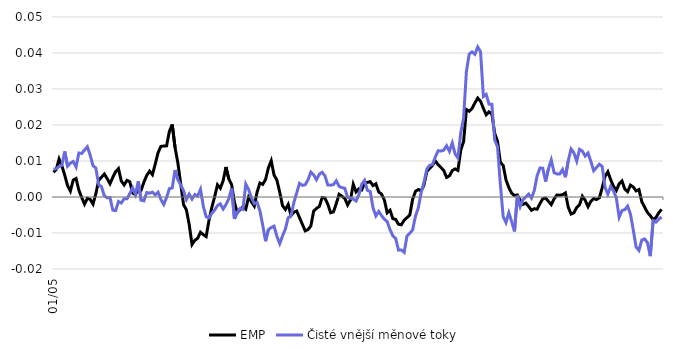
| Category | EMP | Čisté vnější měnové toky |
|---|---|---|
| 2005-01-01 | 0.007 | 0.008 |
| 2005-02-01 | 0.008 | 0.008 |
| 2005-03-01 | 0.011 | 0.008 |
| 2005-04-01 | 0.009 | 0.009 |
| 2005-05-01 | 0.006 | 0.013 |
| 2005-06-01 | 0.003 | 0.009 |
| 2005-07-01 | 0.002 | 0.009 |
| 2005-08-01 | 0.005 | 0.01 |
| 2005-09-01 | 0.005 | 0.008 |
| 2005-10-01 | 0.002 | 0.012 |
| 2005-11-01 | 0 | 0.012 |
| 2005-12-01 | -0.002 | 0.013 |
| 2006-01-01 | 0 | 0.014 |
| 2006-02-01 | -0.001 | 0.012 |
| 2006-03-01 | -0.002 | 0.009 |
| 2006-04-01 | 0.001 | 0.008 |
| 2006-05-01 | 0.005 | 0.003 |
| 2006-06-01 | 0.006 | 0.003 |
| 2006-07-01 | 0.006 | 0 |
| 2006-08-01 | 0.005 | 0 |
| 2006-09-01 | 0.004 | 0 |
| 2006-10-01 | 0.005 | -0.004 |
| 2006-11-01 | 0.007 | -0.004 |
| 2006-12-01 | 0.008 | -0.001 |
| 2007-01-01 | 0.004 | -0.002 |
| 2007-02-01 | 0.003 | 0 |
| 2007-03-01 | 0.005 | -0.001 |
| 2007-04-01 | 0.004 | 0.001 |
| 2007-05-01 | 0.001 | 0.003 |
| 2007-06-01 | 0.001 | 0.001 |
| 2007-07-01 | 0.002 | 0.004 |
| 2007-08-01 | 0.002 | -0.001 |
| 2007-09-01 | 0.004 | -0.001 |
| 2007-10-01 | 0.006 | 0.001 |
| 2007-11-01 | 0.007 | 0.001 |
| 2007-12-01 | 0.006 | 0.001 |
| 2008-01-01 | 0.009 | 0.001 |
| 2008-02-01 | 0.012 | 0.001 |
| 2008-03-01 | 0.014 | -0.001 |
| 2008-04-01 | 0.014 | -0.002 |
| 2008-05-01 | 0.014 | 0 |
| 2008-06-01 | 0.018 | 0.002 |
| 2008-07-01 | 0.02 | 0.003 |
| 2008-08-01 | 0.014 | 0.008 |
| 2008-09-01 | 0.009 | 0.005 |
| 2008-10-01 | 0.004 | 0.003 |
| 2008-11-01 | -0.002 | 0.002 |
| 2008-12-01 | -0.004 | -0.001 |
| 2009-01-01 | -0.008 | 0.001 |
| 2009-02-01 | -0.013 | -0.001 |
| 2009-03-01 | -0.012 | 0.001 |
| 2009-04-01 | -0.011 | 0 |
| 2009-05-01 | -0.01 | 0.002 |
| 2009-06-01 | -0.01 | -0.003 |
| 2009-07-01 | -0.011 | -0.005 |
| 2009-08-01 | -0.006 | -0.006 |
| 2009-09-01 | -0.003 | -0.005 |
| 2009-10-01 | 0 | -0.004 |
| 2009-11-01 | 0.003 | -0.002 |
| 2009-12-01 | 0.002 | -0.002 |
| 2010-01-01 | 0.004 | -0.003 |
| 2010-02-01 | 0.008 | -0.002 |
| 2010-03-01 | 0.005 | 0 |
| 2010-04-01 | 0.003 | 0.002 |
| 2010-05-01 | -0.002 | -0.006 |
| 2010-06-01 | -0.004 | -0.004 |
| 2010-07-01 | -0.004 | -0.003 |
| 2010-08-01 | -0.003 | -0.003 |
| 2010-09-01 | -0.003 | 0.004 |
| 2010-10-01 | 0 | 0.002 |
| 2010-11-01 | -0.001 | 0 |
| 2010-12-01 | -0.003 | -0.002 |
| 2011-01-01 | 0.001 | -0.001 |
| 2011-02-01 | 0.004 | -0.004 |
| 2011-03-01 | 0.004 | -0.008 |
| 2011-04-01 | 0.005 | -0.012 |
| 2011-05-01 | 0.008 | -0.009 |
| 2011-06-01 | 0.01 | -0.008 |
| 2011-07-01 | 0.006 | -0.008 |
| 2011-08-01 | 0.005 | -0.011 |
| 2011-09-01 | 0.001 | -0.013 |
| 2011-10-01 | -0.002 | -0.011 |
| 2011-11-01 | -0.003 | -0.009 |
| 2011-12-01 | -0.002 | -0.006 |
| 2012-01-01 | -0.005 | -0.005 |
| 2012-02-01 | -0.004 | -0.002 |
| 2012-03-01 | -0.004 | 0.001 |
| 2012-04-01 | -0.006 | 0.004 |
| 2012-05-01 | -0.008 | 0.003 |
| 2012-06-01 | -0.009 | 0.003 |
| 2012-07-01 | -0.009 | 0.005 |
| 2012-08-01 | -0.008 | 0.007 |
| 2012-09-01 | -0.004 | 0.006 |
| 2012-10-01 | -0.003 | 0.005 |
| 2012-11-01 | -0.003 | 0.006 |
| 2012-12-01 | 0 | 0.007 |
| 2013-01-01 | 0 | 0.006 |
| 2013-02-01 | -0.002 | 0.003 |
| 2013-03-01 | -0.004 | 0.003 |
| 2013-04-01 | -0.004 | 0.003 |
| 2013-05-01 | -0.002 | 0.004 |
| 2013-06-01 | 0.001 | 0.003 |
| 2013-07-01 | 0 | 0.003 |
| 2013-08-01 | 0 | 0.002 |
| 2013-09-01 | -0.002 | 0 |
| 2013-10-01 | -0.001 | 0 |
| 2013-11-01 | 0.004 | -0.001 |
| 2013-12-01 | 0.001 | -0.001 |
| 2014-01-01 | 0.002 | 0.001 |
| 2014-02-01 | 0.002 | 0.004 |
| 2014-03-01 | 0.004 | 0.005 |
| 2014-04-01 | 0.004 | 0.002 |
| 2014-05-01 | 0.004 | 0.002 |
| 2014-06-01 | 0.003 | -0.003 |
| 2014-07-01 | 0.004 | -0.005 |
| 2014-08-01 | 0.001 | -0.004 |
| 2014-09-01 | 0.001 | -0.005 |
| 2014-10-01 | -0.001 | -0.006 |
| 2014-11-01 | -0.004 | -0.007 |
| 2014-12-01 | -0.004 | -0.009 |
| 2015-01-01 | -0.006 | -0.011 |
| 2015-02-01 | -0.006 | -0.012 |
| 2015-03-01 | -0.008 | -0.015 |
| 2015-04-01 | -0.008 | -0.015 |
| 2015-05-01 | -0.006 | -0.015 |
| 2015-06-01 | -0.006 | -0.011 |
| 2015-07-01 | -0.005 | -0.01 |
| 2015-08-01 | -0.001 | -0.009 |
| 2015-09-01 | 0.002 | -0.005 |
| 2015-10-01 | 0.002 | -0.003 |
| 2015-11-01 | 0.002 | 0.001 |
| 2015-12-01 | 0.003 | 0.004 |
| 2016-01-01 | 0.007 | 0.008 |
| 2016-02-01 | 0.008 | 0.009 |
| 2016-03-01 | 0.009 | 0.009 |
| 2016-04-01 | 0.01 | 0.011 |
| 2016-05-01 | 0.009 | 0.013 |
| 2016-06-01 | 0.008 | 0.013 |
| 2016-07-01 | 0.007 | 0.013 |
| 2016-08-01 | 0.005 | 0.014 |
| 2016-09-01 | 0.006 | 0.013 |
| 2016-10-01 | 0.007 | 0.015 |
| 2016-11-01 | 0.008 | 0.012 |
| 2016-12-01 | 0.007 | 0.011 |
| 2017-01-01 | 0.013 | 0.018 |
| 2017-02-01 | 0.015 | 0.022 |
| 2017-03-01 | 0.024 | 0.035 |
| 2017-04-01 | 0.024 | 0.04 |
| 2017-05-01 | 0.025 | 0.04 |
| 2017-06-01 | 0.026 | 0.04 |
| 2017-07-01 | 0.027 | 0.042 |
| 2017-08-01 | 0.027 | 0.04 |
| 2017-09-01 | 0.025 | 0.028 |
| 2017-10-01 | 0.023 | 0.028 |
| 2017-11-01 | 0.024 | 0.026 |
| 2017-12-01 | 0.023 | 0.026 |
| 2018-01-01 | 0.018 | 0.016 |
| 2018-02-01 | 0.015 | 0.014 |
| 2018-03-01 | 0.01 | 0.004 |
| 2018-04-01 | 0.009 | -0.005 |
| 2018-05-01 | 0.005 | -0.007 |
| 2018-06-01 | 0.003 | -0.004 |
| 2018-07-01 | 0.001 | -0.007 |
| 2018-08-01 | 0 | -0.01 |
| 2018-09-01 | 0.001 | 0 |
| 2018-10-01 | -0.001 | -0.003 |
| 2018-11-01 | -0.002 | -0.001 |
| 2018-12-01 | -0.002 | 0 |
| 2019-01-01 | -0.003 | 0.001 |
| 2019-02-01 | -0.004 | 0 |
| 2019-03-01 | -0.003 | 0.002 |
| 2019-04-01 | -0.003 | 0.006 |
| 2019-05-01 | -0.002 | 0.008 |
| 2019-06-01 | 0 | 0.008 |
| 2019-07-01 | 0 | 0.004 |
| 2019-08-01 | -0.001 | 0.008 |
| 2019-09-01 | -0.002 | 0.01 |
| 2019-10-01 | 0 | 0.007 |
| 2019-11-01 | 0.001 | 0.006 |
| 2019-12-01 | 0 | 0.006 |
| 2020-01-01 | 0.001 | 0.008 |
| 2020-02-01 | 0.001 | 0.006 |
| 2020-03-01 | -0.003 | 0.01 |
| 2020-04-01 | -0.005 | 0.013 |
| 2020-05-01 | -0.004 | 0.012 |
| 2020-06-01 | -0.003 | 0.01 |
| 2020-07-01 | -0.002 | 0.013 |
| 2020-08-01 | 0 | 0.013 |
| 2020-09-01 | -0.001 | 0.011 |
| 2020-10-01 | -0.003 | 0.012 |
| 2020-11-01 | -0.001 | 0.01 |
| 2020-12-01 | 0 | 0.007 |
| 2021-01-01 | -0.001 | 0.008 |
| 2021-02-01 | 0 | 0.009 |
| 2021-03-01 | 0.003 | 0.008 |
| 2021-04-01 | 0.006 | 0.003 |
| 2021-05-01 | 0.007 | 0.001 |
| 2021-06-01 | 0.005 | 0.003 |
| 2021-07-01 | 0.003 | 0.002 |
| 2021-08-01 | 0.002 | 0 |
| 2021-09-01 | 0.004 | -0.006 |
| 2021-10-01 | 0.004 | -0.004 |
| 2021-11-01 | 0.002 | -0.004 |
| 2021-12-01 | 0.001 | -0.003 |
| 2022-01-01 | 0.003 | -0.005 |
| 2022-02-01 | 0.003 | -0.009 |
| 2022-03-01 | 0.002 | -0.014 |
| 2022-04-01 | 0.002 | -0.015 |
| 2022-05-01 | -0.001 | -0.012 |
| 2022-06-01 | -0.003 | -0.012 |
| 2022-07-01 | -0.004 | -0.013 |
| 2022-08-01 | -0.005 | -0.016 |
| 2022-09-01 | -0.006 | -0.007 |
| 2022-10-01 | -0.006 | -0.007 |
| 2022-11-01 | -0.004 | -0.006 |
| 2022-12-01 | -0.003 | -0.006 |